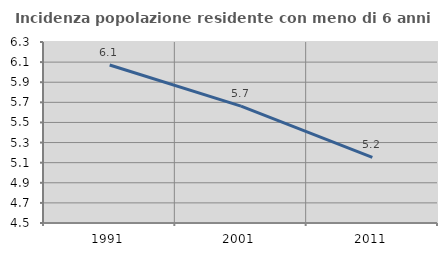
| Category | Incidenza popolazione residente con meno di 6 anni |
|---|---|
| 1991.0 | 6.072 |
| 2001.0 | 5.663 |
| 2011.0 | 5.153 |